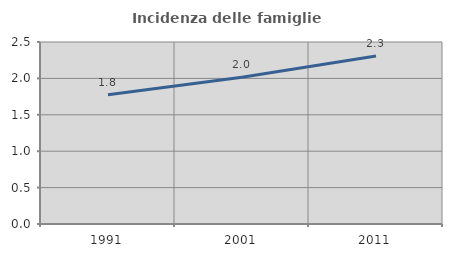
| Category | Incidenza delle famiglie numerose |
|---|---|
| 1991.0 | 1.775 |
| 2001.0 | 2.015 |
| 2011.0 | 2.306 |